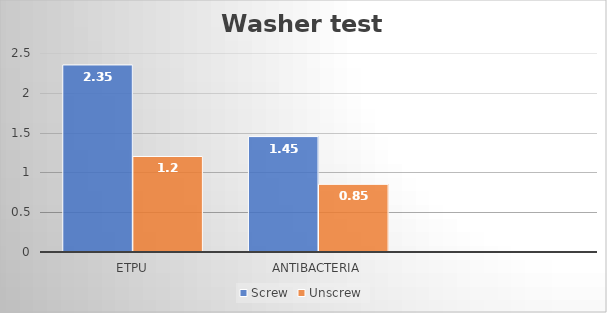
| Category | Screw | Unscrew |
|---|---|---|
| eTPU | 2.35 | 1.2 |
| Antibacteria | 1.45 | 0.85 |